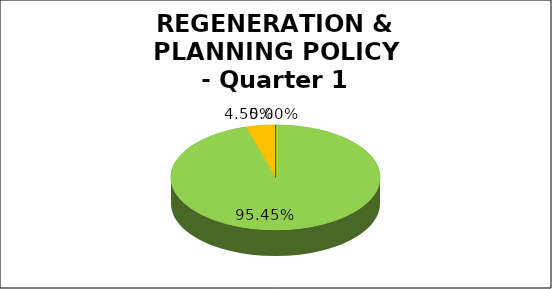
| Category | Q1 |
|---|---|
| Green | 0.955 |
| Amber | 0.045 |
| Red | 0 |